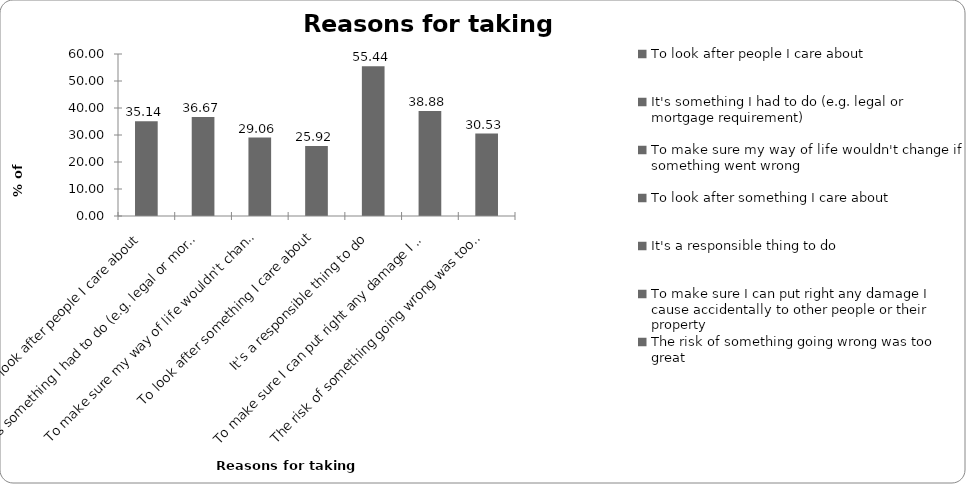
| Category | Reasons for taking insurance |
|---|---|
| To look after people I care about | 35.137 |
| It's something I had to do (e.g. legal or mortgage requirement) | 36.673 |
| To make sure my way of life wouldn't change if something went wrong | 29.058 |
| To look after something I care about | 25.919 |
| It's a responsible thing to do | 55.444 |
| To make sure I can put right any damage I cause accidentally to other people or their property | 38.878 |
| The risk of something going wrong was too great | 30.528 |